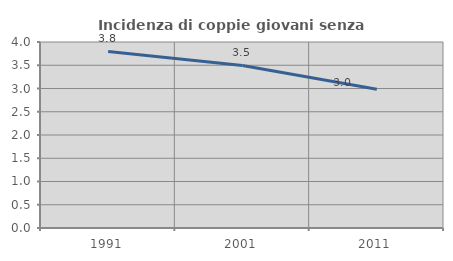
| Category | Incidenza di coppie giovani senza figli |
|---|---|
| 1991.0 | 3.797 |
| 2001.0 | 3.497 |
| 2011.0 | 2.985 |